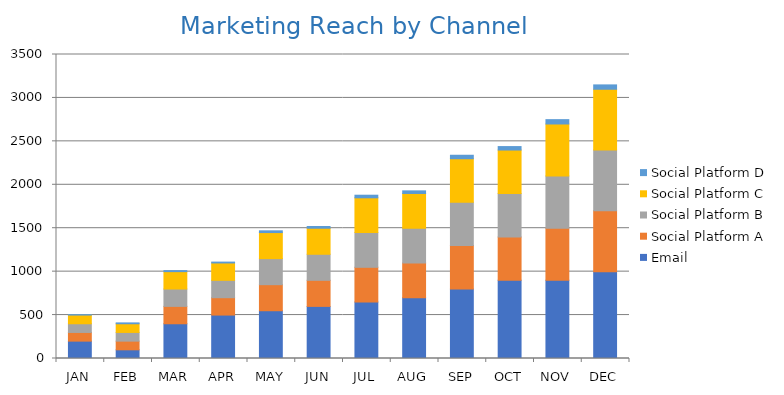
| Category | Email | Social Platform A | Social Platform B | Social Platform C | Social Platform D |
|---|---|---|---|---|---|
| JAN | 200 | 100 | 100 | 100 | 5 |
| FEB | 100 | 100 | 100 | 100 | 10 |
| MAR | 400 | 200 | 200 | 200 | 12 |
| APR | 500 | 200 | 200 | 200 | 10 |
| MAY | 550 | 300 | 300 | 300 | 20 |
| JUN | 600 | 300 | 300 | 300 | 20 |
| JUL | 650 | 400 | 400 | 400 | 30 |
| AUG | 700 | 400 | 400 | 400 | 30 |
| SEP | 800 | 500 | 500 | 500 | 40 |
| OCT | 900 | 500 | 500 | 500 | 40 |
| NOV | 900 | 600 | 600 | 600 | 50 |
| DEC | 1000 | 700 | 700 | 700 | 50 |